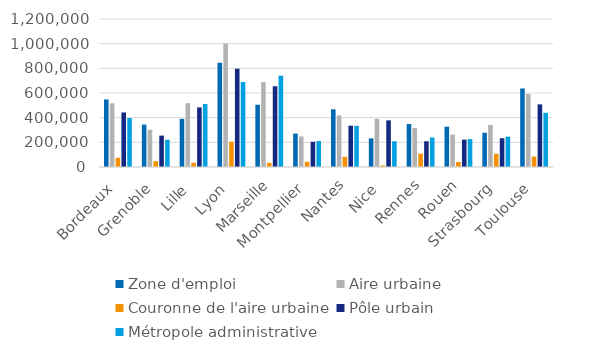
| Category | Zone d'emploi | Aire urbaine | Couronne de l'aire urbaine | Pôle urbain | Métropole administrative |
|---|---|---|---|---|---|
| Bordeaux | 547587.076 | 516912.4 | 74435.464 | 442476.936 | 397477.569 |
| Grenoble | 344045.361 | 301845.342 | 47257.593 | 254587.749 | 220948.966 |
| Lille | 390344.311 | 517772.383 | 34740.165 | 483032.218 | 511072.764 |
| Lyon | 845153.185 | 1001494.96 | 204688.375 | 796806.585 | 689073.433 |
| Marseille | 504891.088 | 688616.696 | 33770.468 | 654846.227 | 740292.358 |
| Montpellier | 271093.994 | 247405.019 | 42848.431 | 204556.588 | 210438.58 |
| Nantes | 467845.701 | 418143.415 | 83066.506 | 335076.909 | 333591.277 |
| Nice | 232144.575 | 390798.16 | 12374.528 | 378423.632 | 208457.269 |
| Rennes | 348996.204 | 316184.178 | 107584.807 | 208599.371 | 239096.908 |
| Rouen | 326985.283 | 262760.846 | 40821.224 | 221939.622 | 226079.423 |
| Strasbourg | 277476.825 | 340542.707 | 107443.724 | 233098.983 | 246131.235 |
| Toulouse | 636554.8 | 591635.333 | 83792.693 | 507842.64 | 439514.24 |